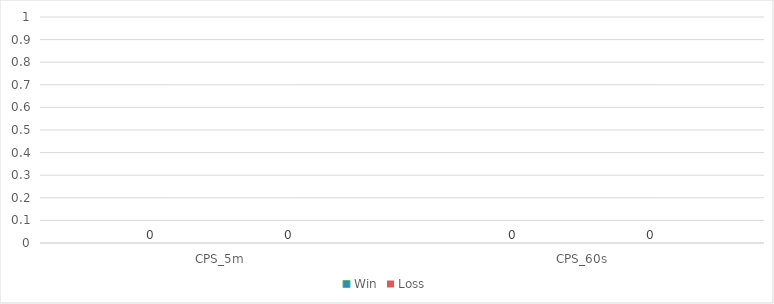
| Category | Win | Loss |
|---|---|---|
| CPS_5m | 0 | 0 |
| CPS_60s | 0 | 0 |